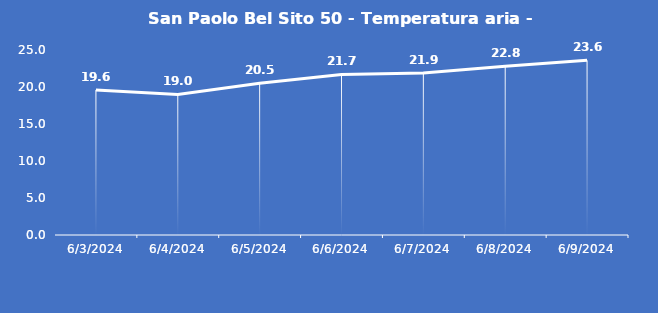
| Category | San Paolo Bel Sito 50 - Temperatura aria - Grezzo (°C) |
|---|---|
| 6/3/24 | 19.6 |
| 6/4/24 | 19 |
| 6/5/24 | 20.5 |
| 6/6/24 | 21.7 |
| 6/7/24 | 21.9 |
| 6/8/24 | 22.8 |
| 6/9/24 | 23.6 |